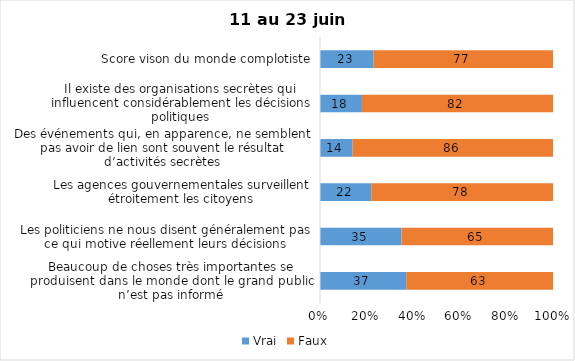
| Category | Vrai | Faux |
|---|---|---|
| Beaucoup de choses très importantes se produisent dans le monde dont le grand public n’est pas informé | 37 | 63 |
| Les politiciens ne nous disent généralement pas ce qui motive réellement leurs décisions | 35 | 65 |
| Les agences gouvernementales surveillent étroitement les citoyens | 22 | 78 |
| Des événements qui, en apparence, ne semblent pas avoir de lien sont souvent le résultat d’activités secrètes | 14 | 86 |
| Il existe des organisations secrètes qui influencent considérablement les décisions politiques | 18 | 82 |
| Score vison du monde complotiste | 23 | 77 |